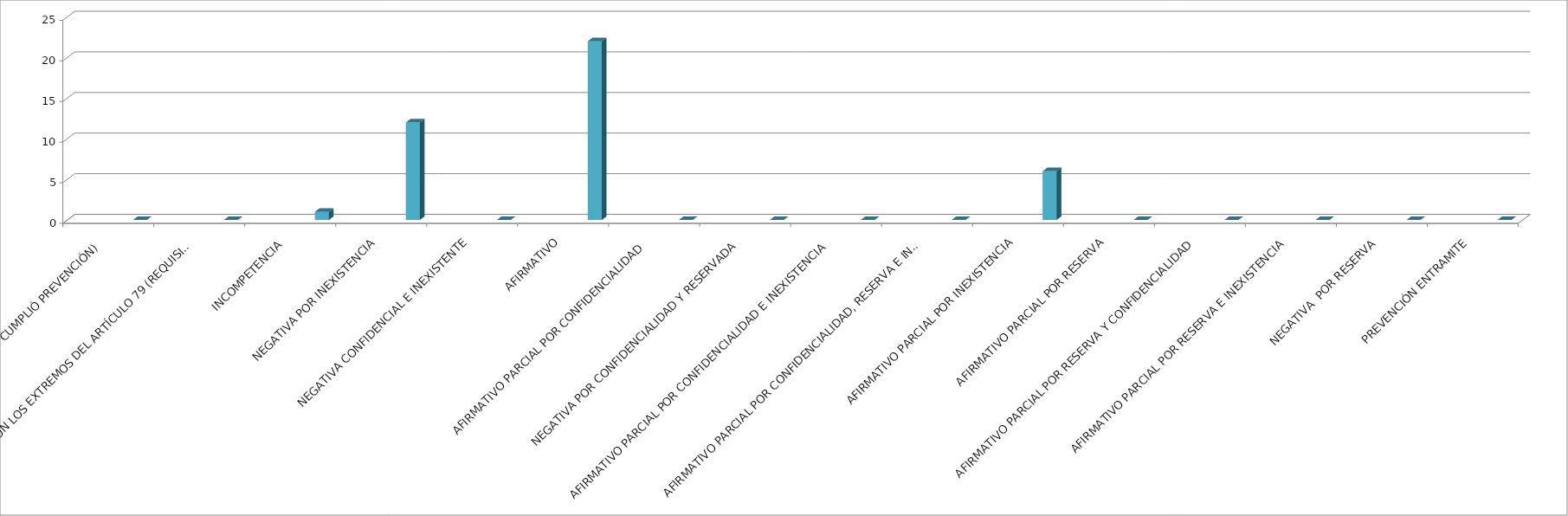
| Category | Series 0 | Series 1 | Series 2 | Series 3 | Series 4 |
|---|---|---|---|---|---|
| SE TIENE POR NO PRESENTADA ( NO CUMPLIÓ PREVENCIÓN) |  |  |  |  | 0 |
| NO CUMPLIO CON LOS EXTREMOS DEL ARTÍCULO 79 (REQUISITOS) |  |  |  |  | 0 |
| INCOMPETENCIA  |  |  |  |  | 1 |
| NEGATIVA POR INEXISTENCIA |  |  |  |  | 12 |
| NEGATIVA CONFIDENCIAL E INEXISTENTE |  |  |  |  | 0 |
| AFIRMATIVO |  |  |  |  | 22 |
| AFIRMATIVO PARCIAL POR CONFIDENCIALIDAD  |  |  |  |  | 0 |
| NEGATIVA POR CONFIDENCIALIDAD Y RESERVADA |  |  |  |  | 0 |
| AFIRMATIVO PARCIAL POR CONFIDENCIALIDAD E INEXISTENCIA |  |  |  |  | 0 |
| AFIRMATIVO PARCIAL POR CONFIDENCIALIDAD, RESERVA E INEXISTENCIA |  |  |  |  | 0 |
| AFIRMATIVO PARCIAL POR INEXISTENCIA |  |  |  |  | 6 |
| AFIRMATIVO PARCIAL POR RESERVA |  |  |  |  | 0 |
| AFIRMATIVO PARCIAL POR RESERVA Y CONFIDENCIALIDAD |  |  |  |  | 0 |
| AFIRMATIVO PARCIAL POR RESERVA E INEXISTENCIA |  |  |  |  | 0 |
| NEGATIVA  POR RESERVA |  |  |  |  | 0 |
| PREVENCIÓN ENTRAMITE |  |  |  |  | 0 |